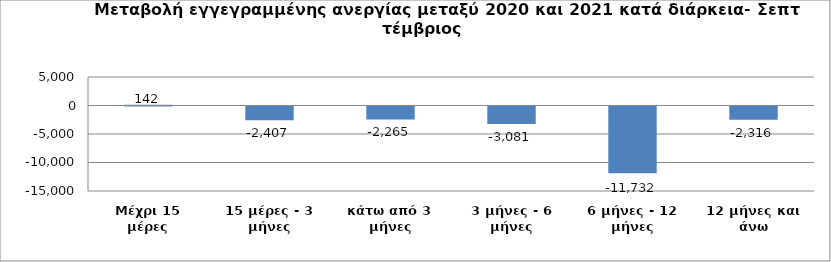
| Category | Series 0 |
|---|---|
| Μέχρι 15 μέρες | 142 |
| 15 μέρες - 3 μήνες | -2407 |
| κάτω από 3 μήνες | -2265 |
| 3 μήνες - 6 μήνες | -3081 |
| 6 μήνες - 12 μήνες | -11732 |
| 12 μήνες και άνω | -2316 |